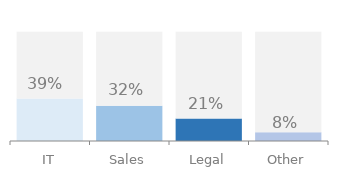
| Category | Series 0 | Series 1 |
|---|---|---|
| IT | 0.389 | 0.611 |
| Sales | 0.324 | 0.676 |
| Legal | 0.206 | 0.794 |
| Other | 0.081 | 0.919 |